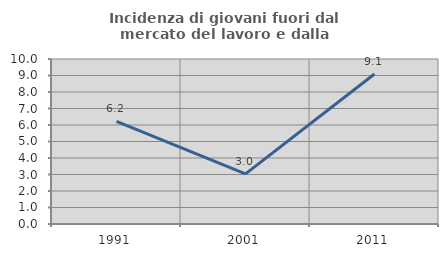
| Category | Incidenza di giovani fuori dal mercato del lavoro e dalla formazione  |
|---|---|
| 1991.0 | 6.225 |
| 2001.0 | 3.04 |
| 2011.0 | 9.091 |